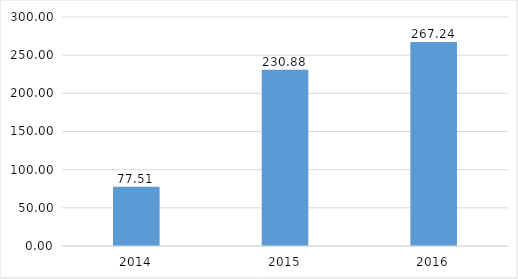
| Category | Коэффициент оборачиваемости КЗ |
|---|---|
| 2014.0 | 77.512 |
| 2015.0 | 230.885 |
| 2016.0 | 267.241 |